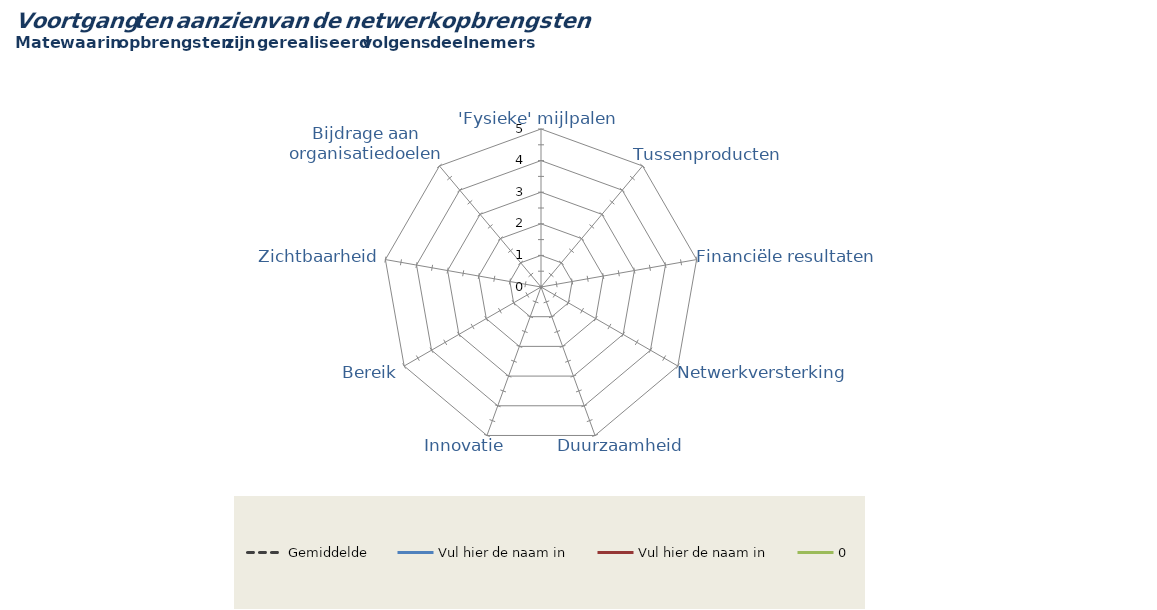
| Category | Gemiddelde | Vul hier de naam in | 0 |
|---|---|---|---|
| 'Fysieke' mijlpalen | 0 | 0 | 0 |
| Tussenproducten | 0 | 0 | 0 |
| Financiële resultaten | 0 | 0 | 0 |
| Netwerkversterking | 0 | 0 | 0 |
| Duurzaamheid | 0 | 0 | 0 |
| Innovatie | 0 | 0 | 0 |
| Bereik | 0 | 0 | 0 |
| Zichtbaarheid | 0 | 0 | 0 |
| Bijdrage aan organisatiedoelen | 0 | 0 | 0 |